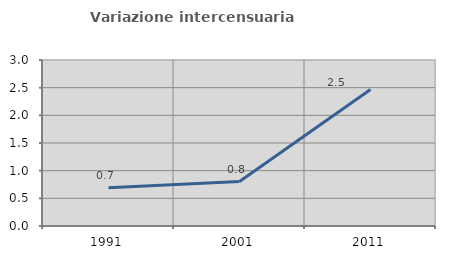
| Category | Variazione intercensuaria annua |
|---|---|
| 1991.0 | 0.692 |
| 2001.0 | 0.804 |
| 2011.0 | 2.468 |